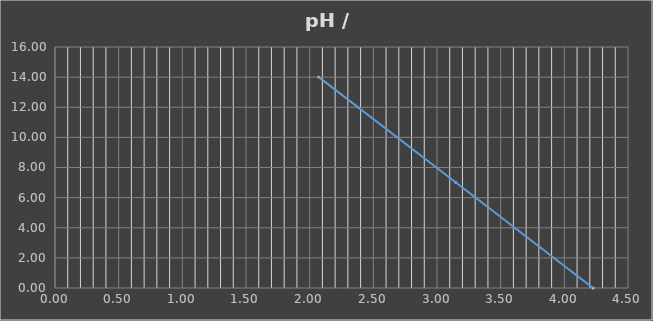
| Category | pH |
|---|---|
| 2.071538461538462 | 14 |
| 3.1484615384615386 | 7 |
| 4.225384615384615 | 0 |